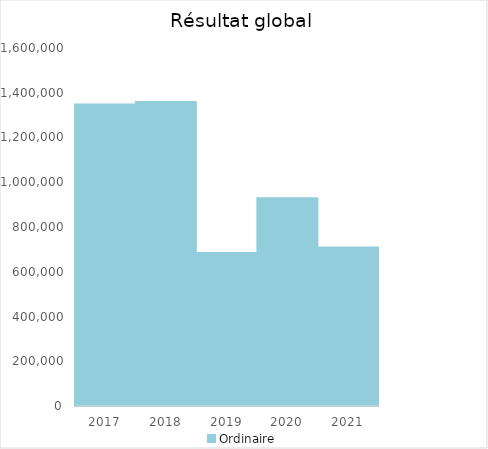
| Category |   | Ordinaire |    |
|---|---|---|---|
| 2017.0 |  | 1347400.11 |  |
| 2018.0 |  | 1359077.73 |  |
| 2019.0 |  | 683381.05 |  |
| 2020.0 |  | 928337.44 |  |
| 2021.0 |  | 708877.68 |  |